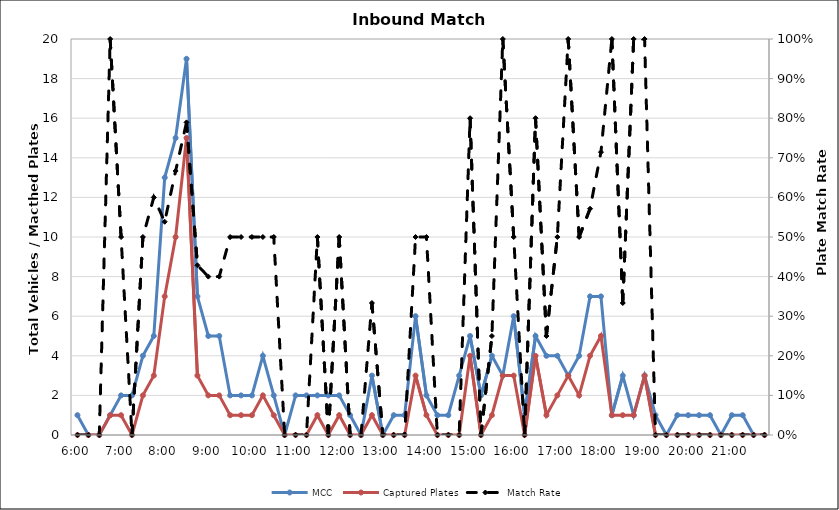
| Category | MCC | Captured Plates |
|---|---|---|
| 0.25 | 1 | 0 |
| 0.260416666666667 | 0 | 0 |
| 0.270833333333333 | 0 | 0 |
| 0.28125 | 1 | 1 |
| 0.291666666666667 | 2 | 1 |
| 0.302083333333333 | 2 | 0 |
| 0.3125 | 4 | 2 |
| 0.322916666666667 | 5 | 3 |
| 0.333333333333333 | 13 | 7 |
| 0.34375 | 15 | 10 |
| 0.354166666666667 | 19 | 15 |
| 0.364583333333333 | 7 | 3 |
| 0.375 | 5 | 2 |
| 0.385416666666667 | 5 | 2 |
| 0.395833333333333 | 2 | 1 |
| 0.40625 | 2 | 1 |
| 0.416666666666667 | 2 | 1 |
| 0.427083333333333 | 4 | 2 |
| 0.4375 | 2 | 1 |
| 0.447916666666667 | 0 | 0 |
| 0.458333333333333 | 2 | 0 |
| 0.46875 | 2 | 0 |
| 0.479166666666667 | 2 | 1 |
| 0.489583333333333 | 2 | 0 |
| 0.5 | 2 | 1 |
| 0.510416666666667 | 1 | 0 |
| 0.520833333333333 | 0 | 0 |
| 0.53125 | 3 | 1 |
| 0.541666666666667 | 0 | 0 |
| 0.552083333333333 | 1 | 0 |
| 0.5625 | 1 | 0 |
| 0.572916666666667 | 6 | 3 |
| 0.583333333333333 | 2 | 1 |
| 0.59375 | 1 | 0 |
| 0.604166666666667 | 1 | 0 |
| 0.614583333333333 | 3 | 0 |
| 0.625 | 5 | 4 |
| 0.635416666666667 | 2 | 0 |
| 0.645833333333333 | 4 | 1 |
| 0.65625 | 3 | 3 |
| 0.666666666666667 | 6 | 3 |
| 0.677083333333333 | 1 | 0 |
| 0.6875 | 5 | 4 |
| 0.697916666666667 | 4 | 1 |
| 0.708333333333333 | 4 | 2 |
| 0.71875 | 3 | 3 |
| 0.729166666666667 | 4 | 2 |
| 0.739583333333333 | 7 | 4 |
| 0.75 | 7 | 5 |
| 0.760416666666667 | 1 | 1 |
| 0.770833333333333 | 3 | 1 |
| 0.78125 | 1 | 1 |
| 0.791666666666667 | 3 | 3 |
| 0.802083333333333 | 1 | 0 |
| 0.8125 | 0 | 0 |
| 0.822916666666667 | 1 | 0 |
| 0.833333333333333 | 1 | 0 |
| 0.84375 | 1 | 0 |
| 0.854166666666667 | 1 | 0 |
| 0.864583333333333 | 0 | 0 |
| 0.875 | 1 | 0 |
| 0.885416666666667 | 1 | 0 |
| 0.895833333333333 | 0 | 0 |
| 0.90625 | 0 | 0 |